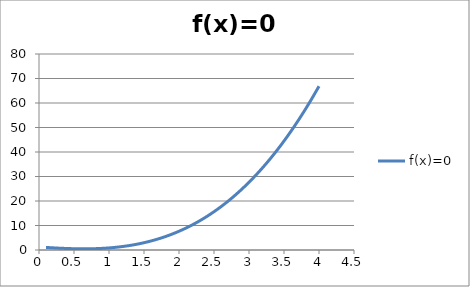
| Category | f(x)=0 |
|---|---|
| 0.1 | 1.057 |
| 0.2 | 0.882 |
| 0.30000000000000004 | 0.731 |
| 0.4 | 0.61 |
| 0.5 | 0.525 |
| 0.6 | 0.482 |
| 0.7 | 0.487 |
| 0.7999999999999999 | 0.546 |
| 0.8999999999999999 | 0.665 |
| 0.9999999999999999 | 0.85 |
| 1.0999999999999999 | 1.107 |
| 1.2 | 1.442 |
| 1.3 | 1.861 |
| 1.4000000000000001 | 2.37 |
| 1.5000000000000002 | 2.975 |
| 1.6000000000000003 | 3.682 |
| 1.7000000000000004 | 4.497 |
| 1.8000000000000005 | 5.426 |
| 1.9000000000000006 | 6.475 |
| 2.0000000000000004 | 7.65 |
| 2.1000000000000005 | 8.957 |
| 2.2000000000000006 | 10.402 |
| 2.3000000000000007 | 11.991 |
| 2.400000000000001 | 13.73 |
| 2.500000000000001 | 15.625 |
| 2.600000000000001 | 17.682 |
| 2.700000000000001 | 19.907 |
| 2.800000000000001 | 22.306 |
| 2.9000000000000012 | 24.885 |
| 3.0000000000000013 | 27.65 |
| 3.1000000000000014 | 30.607 |
| 3.2000000000000015 | 33.762 |
| 3.3000000000000016 | 37.121 |
| 3.4000000000000017 | 40.69 |
| 3.5000000000000018 | 44.475 |
| 3.600000000000002 | 48.482 |
| 3.700000000000002 | 52.717 |
| 3.800000000000002 | 57.186 |
| 3.900000000000002 | 61.895 |
| 4.000000000000002 | 66.85 |